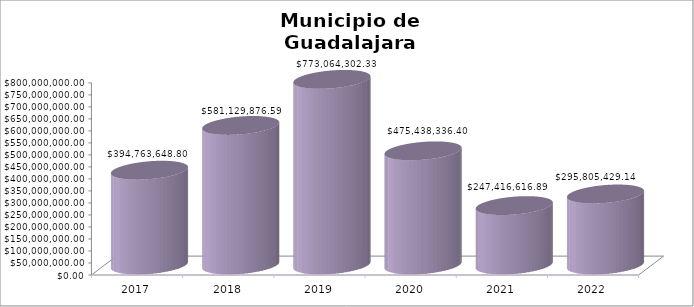
| Category | Municipio de Guadalajara
Deuda Pública 2017 - 2022 |
|---|---|
| 2017.0 | 394763648.8 |
| 2018.0 | 581129876.59 |
| 2019.0 | 773064302.33 |
| 2020.0 | 475438336.4 |
| 2021.0 | 247416616.89 |
| 2022.0 | 295805429.14 |